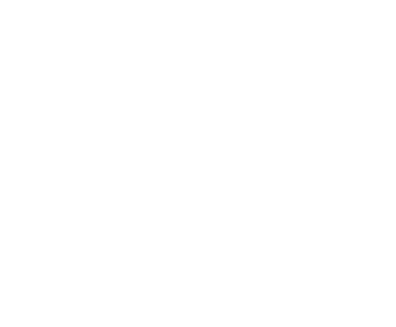
| Category | Series 0 | Series 1 |
|---|---|---|
| Jedzenie | 0 |  |
| Mieszkanie / dom | 0 |  |
| Transport | 0 |  |
| Telekomunikacja | 0 |  |
| Opieka zdrowotna | 0 |  |
| Ubranie | 0 |  |
| Higiena | 0 |  |
| Dzieci | 0 |  |
| Rozrywka | 0 |  |
| Inne wydatki | 0 |  |
| Spłata długów | 0 |  |
| Oszczędności | 0 |  |